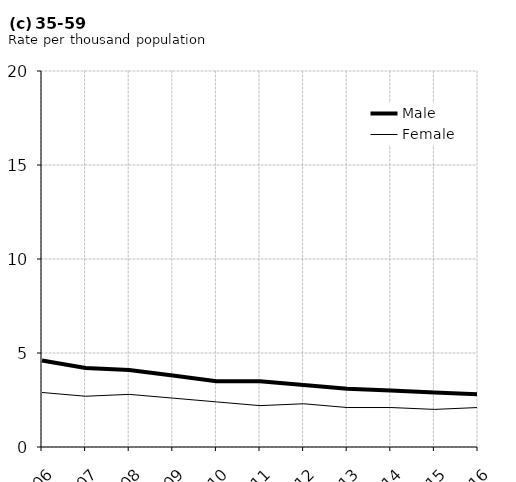
| Category | Male | Female |
|---|---|---|
| 2006.0 | 4.6 | 2.9 |
| 2007.0 | 4.2 | 2.7 |
| 2008.0 | 4.1 | 2.8 |
| 2009.0 | 3.8 | 2.6 |
| 2010.0 | 3.5 | 2.4 |
| 2011.0 | 3.5 | 2.2 |
| 2012.0 | 3.3 | 2.3 |
| 2013.0 | 3.1 | 2.1 |
| 2014.0 | 3 | 2.1 |
| 2015.0 | 2.9 | 2 |
| 2016.0 | 2.8 | 2.1 |